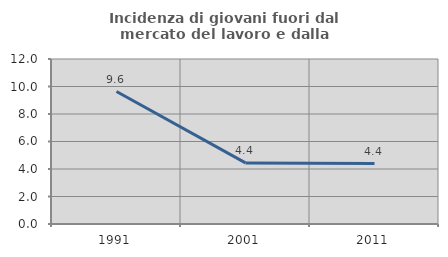
| Category | Incidenza di giovani fuori dal mercato del lavoro e dalla formazione  |
|---|---|
| 1991.0 | 9.633 |
| 2001.0 | 4.444 |
| 2011.0 | 4.396 |